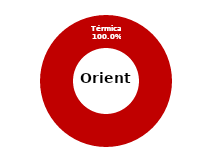
| Category | Oriente |
|---|---|
| Eólica | 0 |
| Hidráulica | 0 |
| Solar | 0 |
| Térmica | 34.88 |